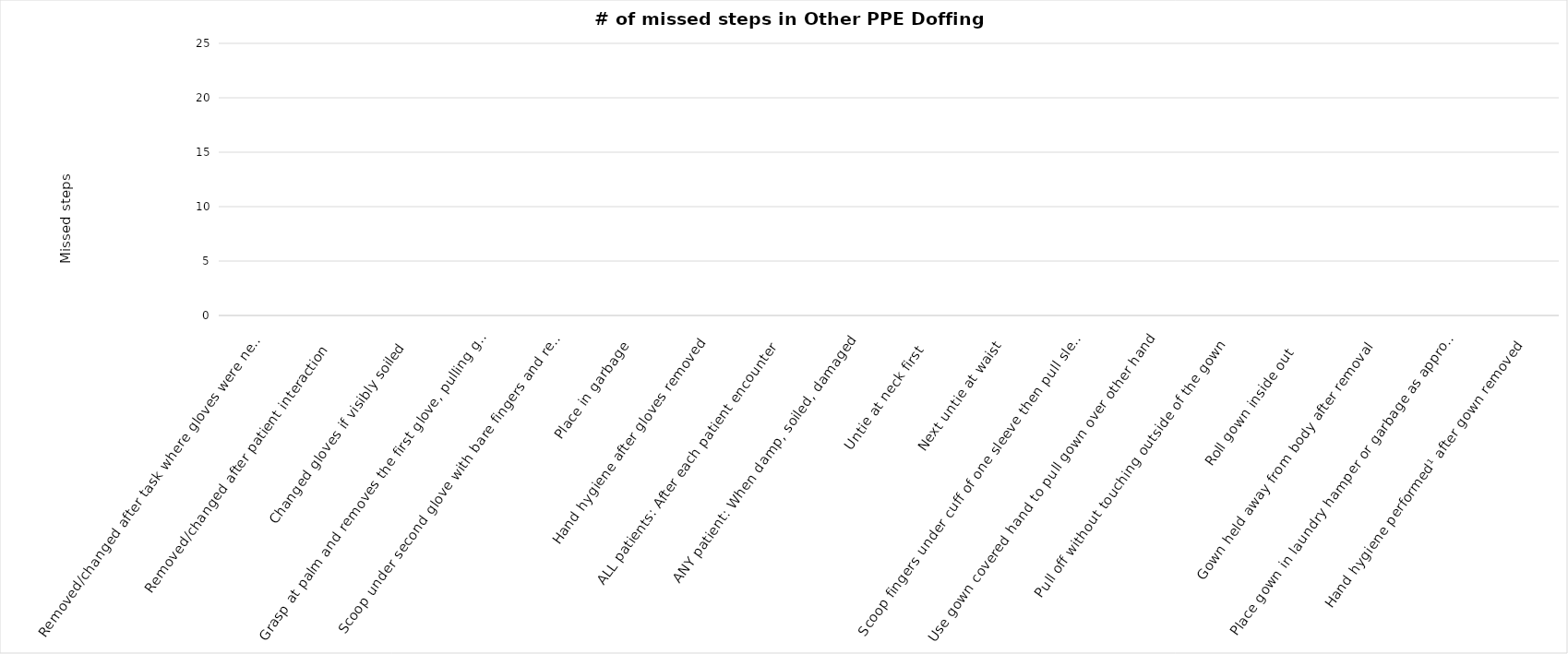
| Category | Series 0 |
|---|---|
| Removed/changed after task where gloves were needed | 0 |
| Removed/changed after patient interaction  | 0 |
| Changed gloves if visibly soiled  | 0 |
| Grasp at palm and removes the first glove, pulling glove inside out.  Holds glove that was removed in the hand still gloved | 0 |
| Scoop under second glove with bare fingers and remove second glove by pulling it inside out over the first glove | 0 |
| Place in garbage | 0 |
| Hand hygiene after gloves removed | 0 |
| ALL patients: After each patient encounter | 0 |
| ANY patient: When damp, soiled, damaged | 0 |
| Untie at neck first | 0 |
| Next untie at waist | 0 |
| Scoop fingers under cuff of one sleeve then pull sleeve over one hand | 0 |
| Use gown covered hand to pull gown over other hand | 0 |
| Pull off without touching outside of the gown | 0 |
| Roll gown inside out  | 0 |
| Gown held away from body after removal | 0 |
| Place gown in laundry hamper or garbage as appropriate | 0 |
| Hand hygiene performed¹ after gown removed | 0 |